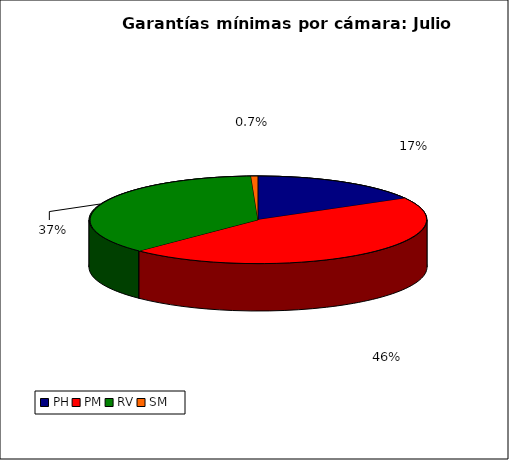
| Category | Series 0 |
|---|---|
| PH | 1999.137 |
| PM | 5404.639 |
| RV | 4376.872 |
| SM | 78.062 |